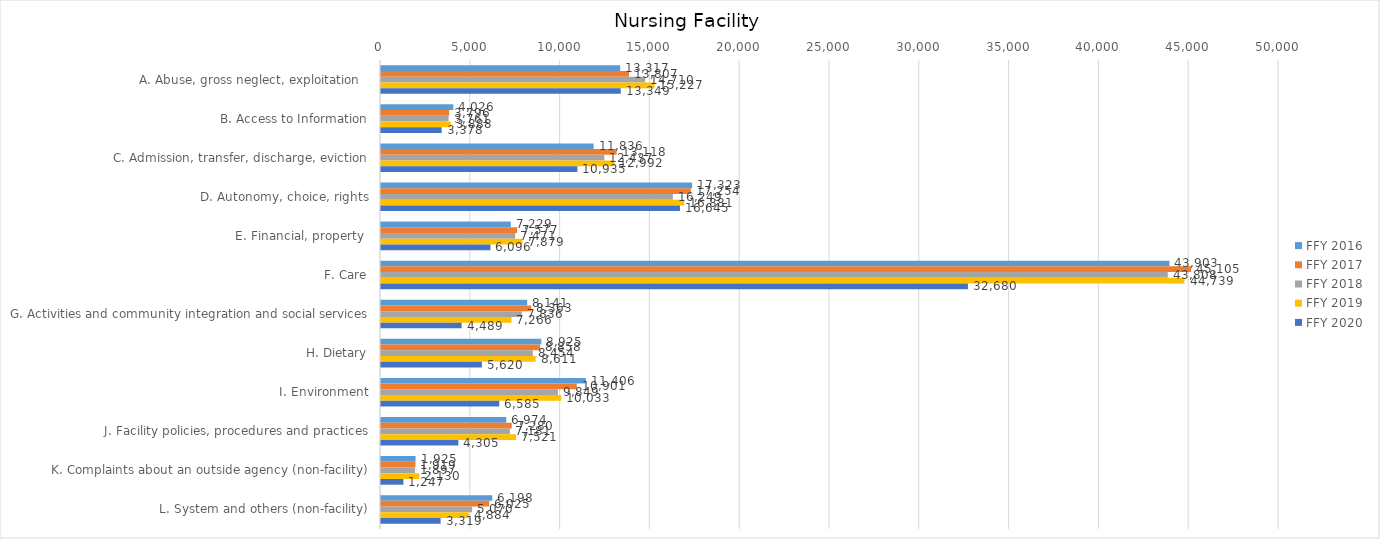
| Category | FFY 2016 | FFY 2017 | FFY 2018 | FFY 2019 | FFY 2020 |
|---|---|---|---|---|---|
| A. Abuse, gross neglect, exploitation   | 13317 | 13807 | 14710 | 15227 | 13349 |
| B. Access to Information | 4026 | 3796 | 3761 | 3888 | 3378 |
| C. Admission, transfer, discharge, eviction | 11836 | 13118 | 12437 | 12992 | 10935 |
| D. Autonomy, choice, rights | 17323 | 17254 | 16249 | 16881 | 16645 |
| E. Financial, property  | 7229 | 7577 | 7471 | 7879 | 6096 |
| F. Care | 43903 | 45105 | 43808 | 44739 | 32680 |
| G. Activities and community integration and social services | 8141 | 8363 | 7836 | 7266 | 4489 |
| H. Dietary | 8925 | 8858 | 8454 | 8611 | 5620 |
| I. Environment | 11406 | 10901 | 9849 | 10033 | 6585 |
| J. Facility policies, procedures and practices | 6974 | 7280 | 7181 | 7521 | 4305 |
| K. Complaints about an outside agency (non-facility) | 1925 | 1919 | 1897 | 2130 | 1247 |
| L. System and others (non-facility) | 6198 | 6025 | 5070 | 4884 | 3319 |